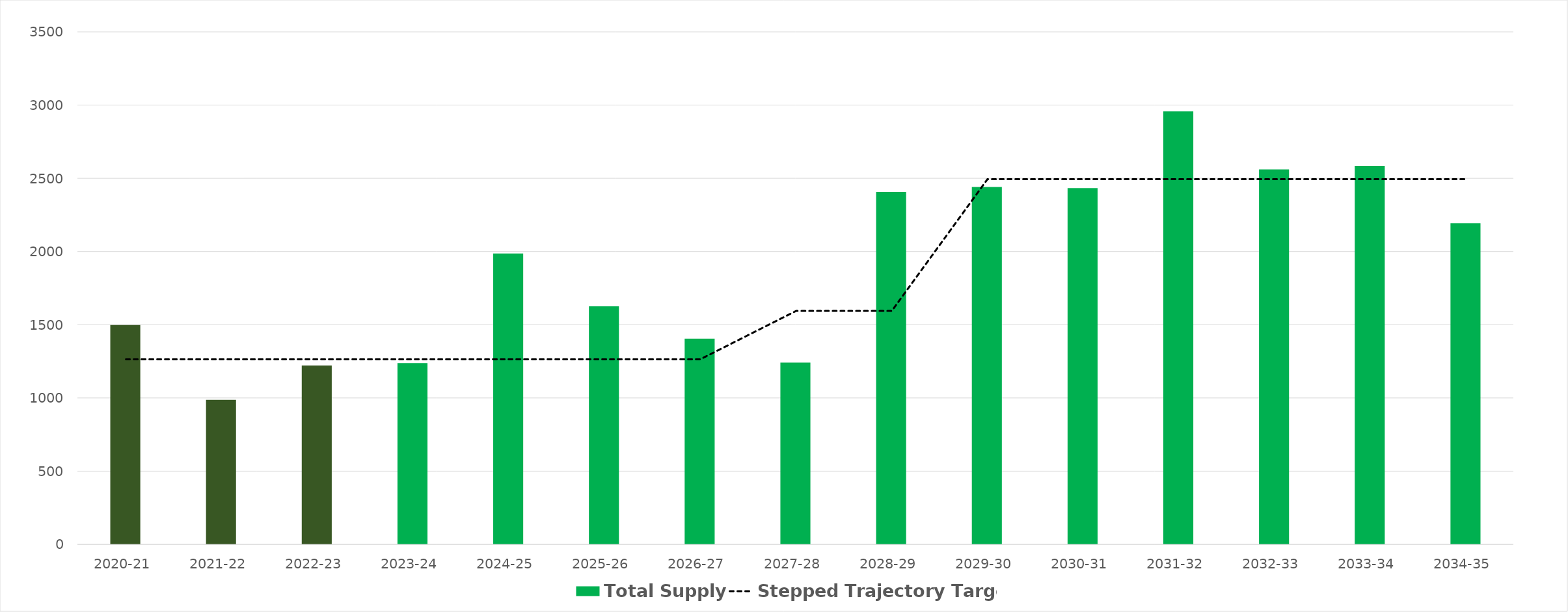
| Category | Total Supply  |
|---|---|
| 0 | 1498 |
| 1 | 987 |
| 2 | 1221 |
| 3 | 1238 |
| 4 | 1987 |
| 5 | 1626 |
| 6 | 1404.6 |
| 7 | 1241.6 |
| 8 | 2407.663 |
| 9 | 2440.688 |
| 10 | 2432.688 |
| 11 | 2956.688 |
| 12 | 2560.688 |
| 13 | 2584.688 |
| 14 | 2193.6 |